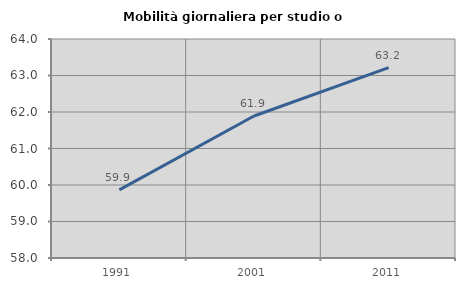
| Category | Mobilità giornaliera per studio o lavoro |
|---|---|
| 1991.0 | 59.868 |
| 2001.0 | 61.891 |
| 2011.0 | 63.214 |